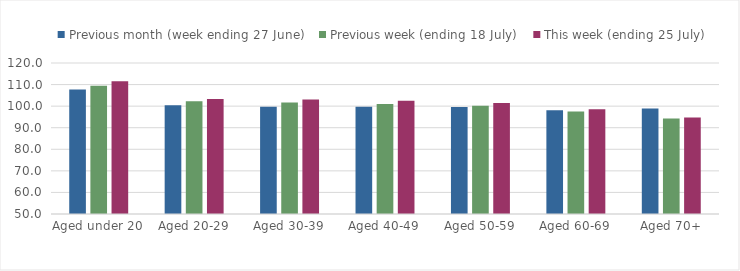
| Category | Previous month (week ending 27 June) | Previous week (ending 18 July) | This week (ending 25 July) |
|---|---|---|---|
| Aged under 20 | 107.664 | 109.412 | 111.525 |
| Aged 20-29 | 100.446 | 102.272 | 103.329 |
| Aged 30-39 | 99.749 | 101.726 | 103.048 |
| Aged 40-49 | 99.736 | 101.004 | 102.502 |
| Aged 50-59 | 99.598 | 100.149 | 101.406 |
| Aged 60-69 | 98.151 | 97.499 | 98.506 |
| Aged 70+ | 98.881 | 94.229 | 94.736 |